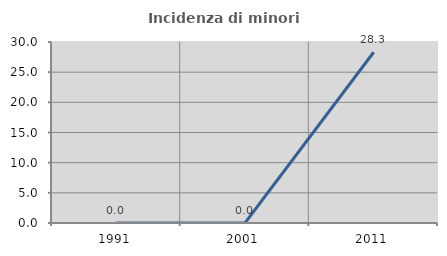
| Category | Incidenza di minori stranieri |
|---|---|
| 1991.0 | 0 |
| 2001.0 | 0 |
| 2011.0 | 28.302 |